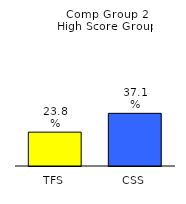
| Category | Series 0 |
|---|---|
| TFS | 0.238 |
| CSS | 0.371 |